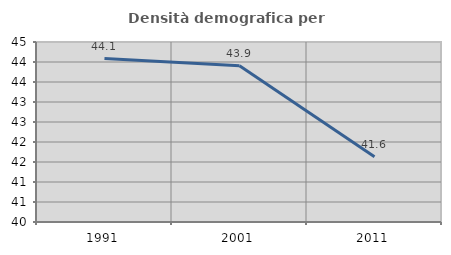
| Category | Densità demografica |
|---|---|
| 1991.0 | 44.087 |
| 2001.0 | 43.909 |
| 2011.0 | 41.629 |